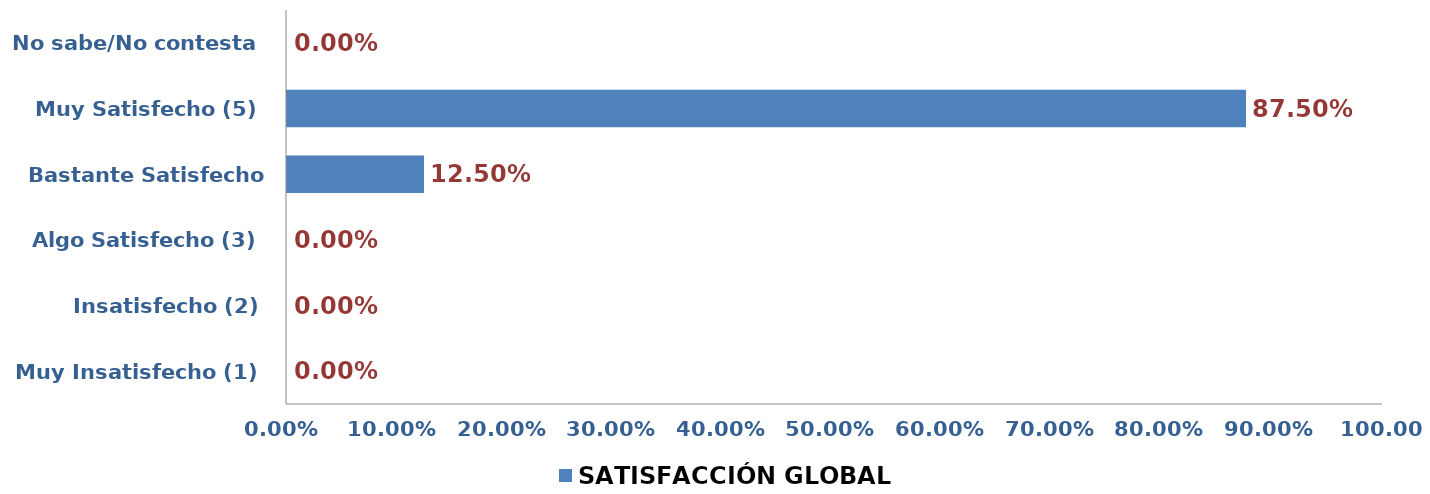
| Category | SATISFACCIÓN GLOBAL |
|---|---|
| Muy Insatisfecho (1) | 0 |
| Insatisfecho (2) | 0 |
| Algo Satisfecho (3) | 0 |
| Bastante Satisfecho (4) | 0.125 |
| Muy Satisfecho (5) | 0.875 |
| No sabe/No contesta | 0 |